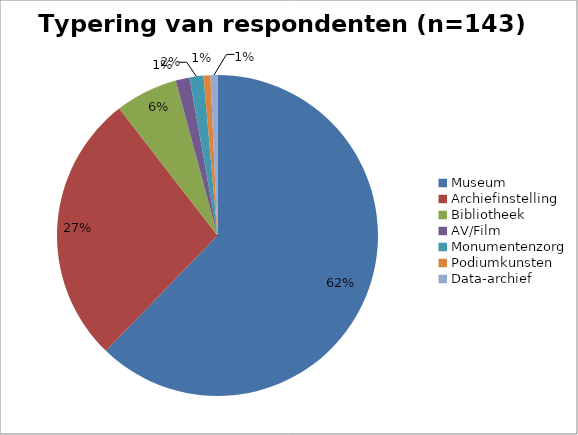
| Category | 2013 |
|---|---|
| Museum | 89 |
| Archiefinstelling | 39 |
| Bibliotheek | 9 |
| AV/Film | 2 |
| Monumentenzorg | 2 |
| Podiumkunsten | 1 |
| Data-archief | 1 |